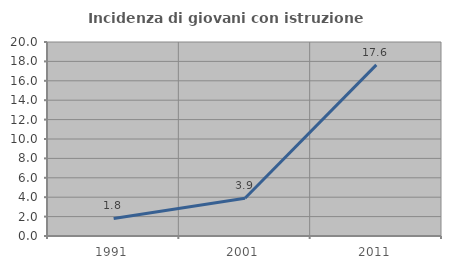
| Category | Incidenza di giovani con istruzione universitaria |
|---|---|
| 1991.0 | 1.807 |
| 2001.0 | 3.896 |
| 2011.0 | 17.647 |